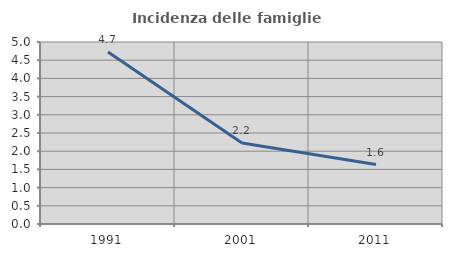
| Category | Incidenza delle famiglie numerose |
|---|---|
| 1991.0 | 4.725 |
| 2001.0 | 2.227 |
| 2011.0 | 1.633 |